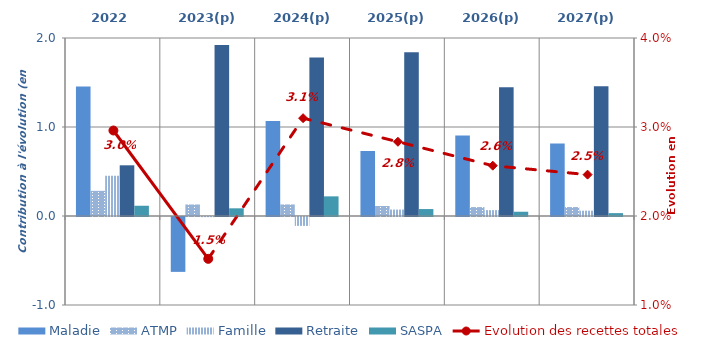
| Category | Maladie | ATMP | Famille | Retraite | SASPA |
|---|---|---|---|---|---|
| 2022 | 1.456 | 0.283 | 0.452 | 0.57 | 0.115 |
| 2023(p) | -0.617 | 0.129 | -0.002 | 1.921 | 0.086 |
| 2024(p) | 1.067 | 0.13 | -0.1 | 1.781 | 0.221 |
| 2025(p) | 0.732 | 0.113 | 0.072 | 1.84 | 0.078 |
| 2026(p) | 0.905 | 0.1 | 0.066 | 1.446 | 0.048 |
| 2027(p) | 0.816 | 0.1 | 0.06 | 1.457 | 0.032 |